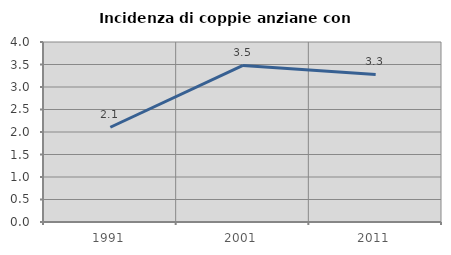
| Category | Incidenza di coppie anziane con figli |
|---|---|
| 1991.0 | 2.106 |
| 2001.0 | 3.479 |
| 2011.0 | 3.278 |